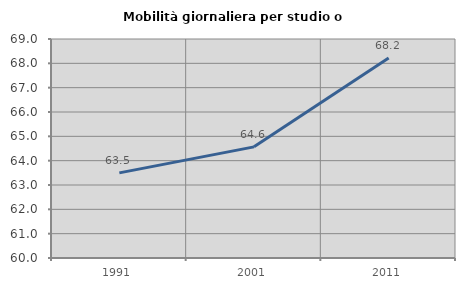
| Category | Mobilità giornaliera per studio o lavoro |
|---|---|
| 1991.0 | 63.498 |
| 2001.0 | 64.568 |
| 2011.0 | 68.217 |